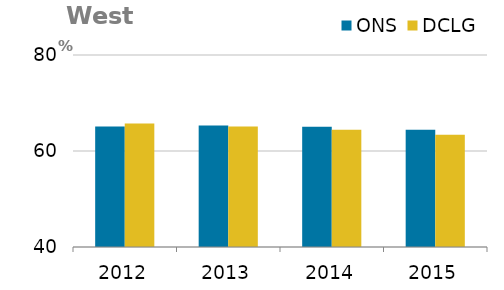
| Category | ONS | DCLG |
|---|---|---|
| 0 | 65.12 | 65.732 |
| 1 | 65.3 | 65.098 |
| 2 | 65.03 | 64.452 |
| 3 | 64.43 | 63.407 |